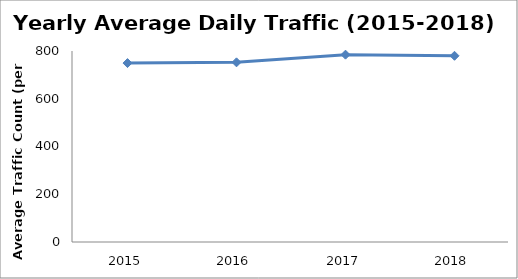
| Category | Series 0 |
|---|---|
| 2015.0 | 749.452 |
| 2016.0 | 752.549 |
| 2017.0 | 784.677 |
| 2018.0 | 779.923 |